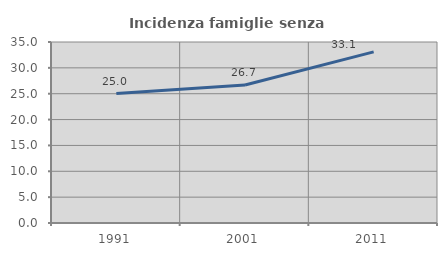
| Category | Incidenza famiglie senza nuclei |
|---|---|
| 1991.0 | 25.039 |
| 2001.0 | 26.687 |
| 2011.0 | 33.083 |